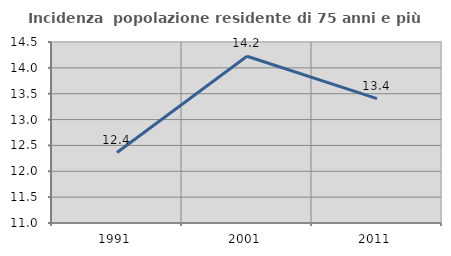
| Category | Incidenza  popolazione residente di 75 anni e più |
|---|---|
| 1991.0 | 12.363 |
| 2001.0 | 14.225 |
| 2011.0 | 13.405 |